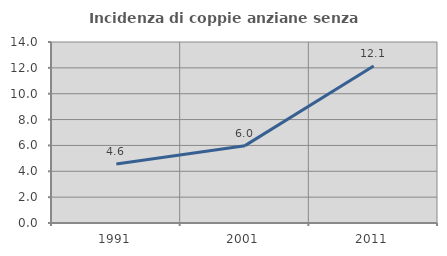
| Category | Incidenza di coppie anziane senza figli  |
|---|---|
| 1991.0 | 4.571 |
| 2001.0 | 5.983 |
| 2011.0 | 12.143 |